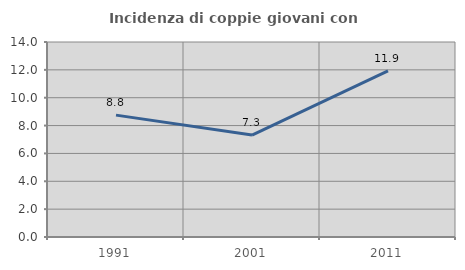
| Category | Incidenza di coppie giovani con figli |
|---|---|
| 1991.0 | 8.75 |
| 2001.0 | 7.317 |
| 2011.0 | 11.927 |